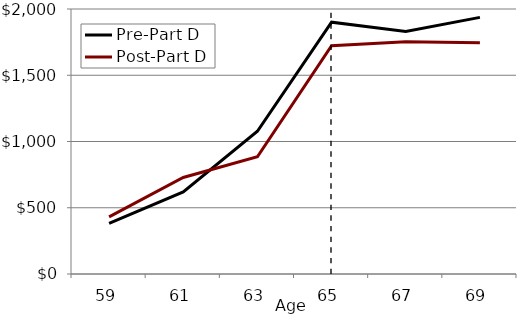
| Category | Pre-Part D | Post-Part D |
|---|---|---|
| 59.0 | 381.402 | 431.68 |
| 61.0 | 619.229 | 728.204 |
| 63.0 | 1077.206 | 884.592 |
| 65.0 | 1900.688 | 1723.183 |
| 67.0 | 1830.771 | 1752.389 |
| 69.0 | 1936.961 | 1745.038 |